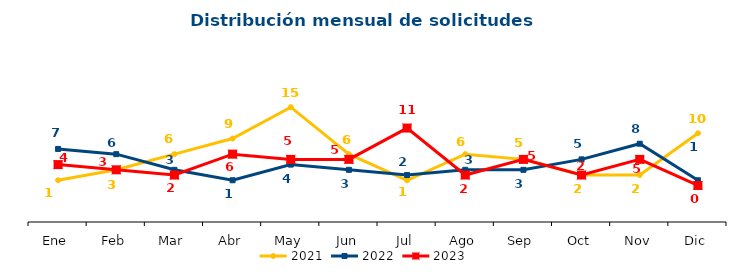
| Category | 2021 | 2022 | 2023 |
|---|---|---|---|
| Ene | 1 | 7 | 4 |
| Feb | 3 | 6 | 3 |
| Mar | 6 | 3 | 2 |
| Abr | 9 | 1 | 6 |
| May | 15 | 4 | 5 |
| Jun | 6 | 3 | 5 |
| Jul | 1 | 2 | 11 |
| Ago | 6 | 3 | 2 |
| Sep | 5 | 3 | 5 |
| Oct | 2 | 5 | 2 |
| Nov | 2 | 8 | 5 |
| Dic | 10 | 1 | 0 |